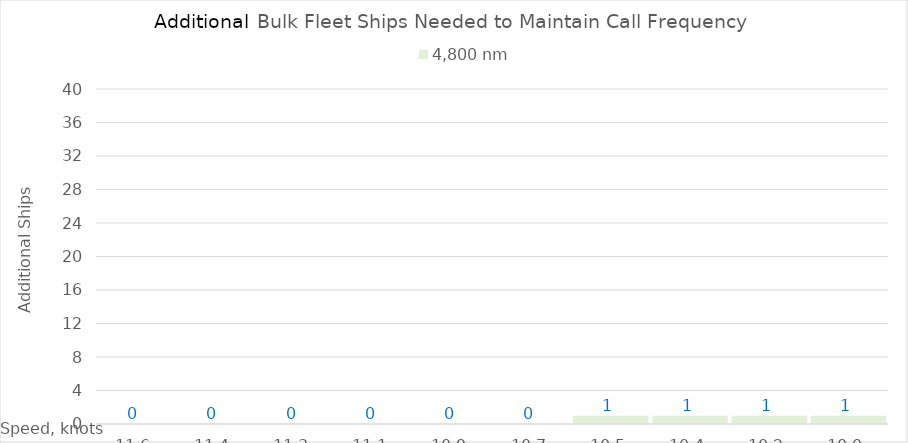
| Category | 4,800 |
|---|---|
| 11.620000000000001 | 0 |
| 11.440000000000001 | 0 |
| 11.260000000000002 | 0 |
| 11.080000000000002 | 0 |
| 10.900000000000002 | 0 |
| 10.720000000000002 | 0 |
| 10.540000000000003 | 1 |
| 10.360000000000003 | 1 |
| 10.180000000000003 | 1 |
| 10.000000000000004 | 1 |